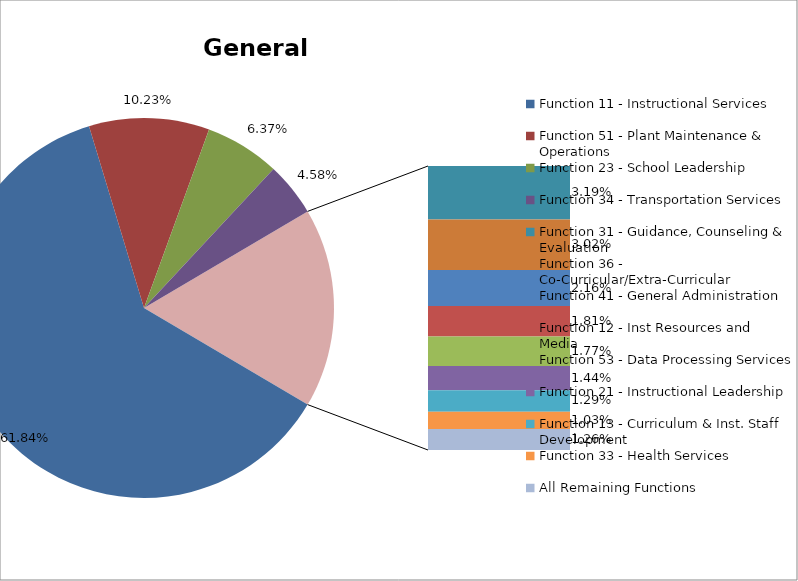
| Category | Series 0 |
|---|---|
| Function 11 - Instructional Services | 0.618 |
| Function 51 - Plant Maintenance & Operations | 0.102 |
| Function 23 - School Leadership | 0.064 |
| Function 34 - Transportation Services | 0.046 |
| Function 31 - Guidance, Counseling & Evaluation | 0.032 |
| Function 36 - Co-Curricular/Extra-Curricular | 0.03 |
| Function 41 - General Administration | 0.022 |
| Function 12 - Inst Resources and Media | 0.018 |
| Function 53 - Data Processing Services | 0.018 |
| Function 21 - Instructional Leadership | 0.014 |
| Function 13 - Curriculum & Inst. Staff Development | 0.013 |
| Function 33 - Health Services | 0.01 |
| All Remaining Functions | 0.013 |